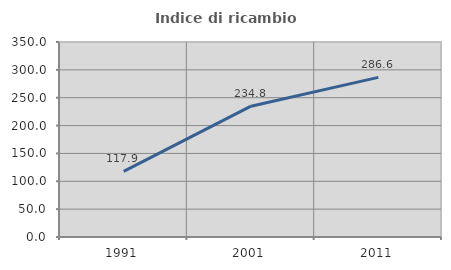
| Category | Indice di ricambio occupazionale  |
|---|---|
| 1991.0 | 117.935 |
| 2001.0 | 234.815 |
| 2011.0 | 286.555 |